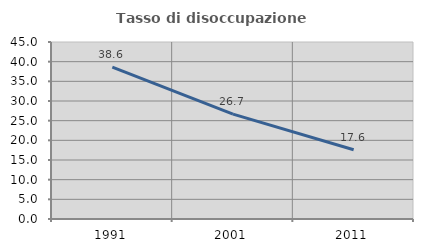
| Category | Tasso di disoccupazione giovanile  |
|---|---|
| 1991.0 | 38.603 |
| 2001.0 | 26.667 |
| 2011.0 | 17.593 |